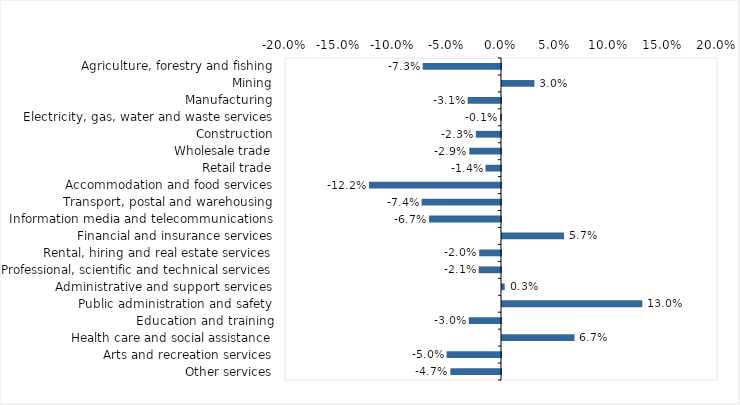
| Category | This week |
|---|---|
| Agriculture, forestry and fishing | -0.072 |
| Mining | 0.03 |
| Manufacturing | -0.031 |
| Electricity, gas, water and waste services | -0.001 |
| Construction | -0.023 |
| Wholesale trade | -0.029 |
| Retail trade | -0.014 |
| Accommodation and food services | -0.122 |
| Transport, postal and warehousing | -0.074 |
| Information media and telecommunications | -0.067 |
| Financial and insurance services | 0.057 |
| Rental, hiring and real estate services | -0.02 |
| Professional, scientific and technical services | -0.021 |
| Administrative and support services | 0.002 |
| Public administration and safety | 0.13 |
| Education and training | -0.03 |
| Health care and social assistance | 0.067 |
| Arts and recreation services | -0.05 |
| Other services | -0.047 |